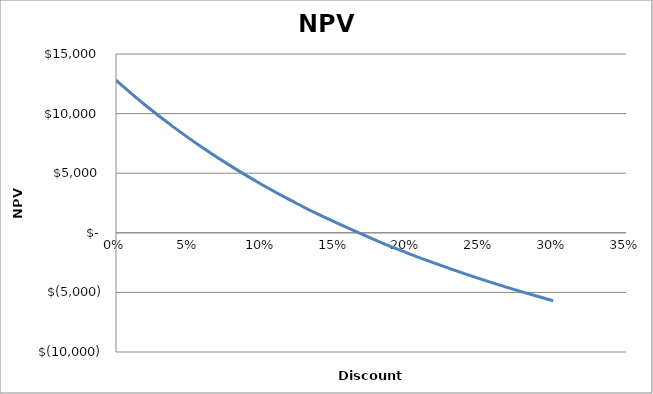
| Category | Series 0 |
|---|---|
| 0.0 | 12800 |
| 0.02 | 10720.54 |
| 0.04 | 8826.34 |
| 0.06 | 7096.153 |
| 0.08 | 5511.622 |
| 0.1 | 4056.832 |
| 0.12 | 2717.94 |
| 0.14 | 1482.868 |
| 0.18 | -716.812 |
| 0.2 | -1698.87 |
| 0.22 | -2612.342 |
| 0.24 | -3463.609 |
| 0.26 | -4258.337 |
| 0.28 | -5001.561 |
| 0.3 | -5697.776 |